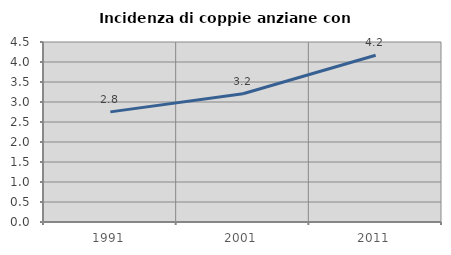
| Category | Incidenza di coppie anziane con figli |
|---|---|
| 1991.0 | 2.753 |
| 2001.0 | 3.206 |
| 2011.0 | 4.17 |